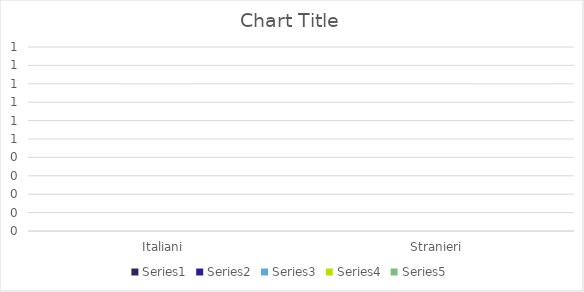
| Category | Series 0 | Series 1 | Series 2 | Series 3 | Series 4 |
|---|---|---|---|---|---|
| Italiani | 0 | 0 | 0 | 0 | 0 |
| Stranieri | 0 | 0 | 0 | 0 | 0 |